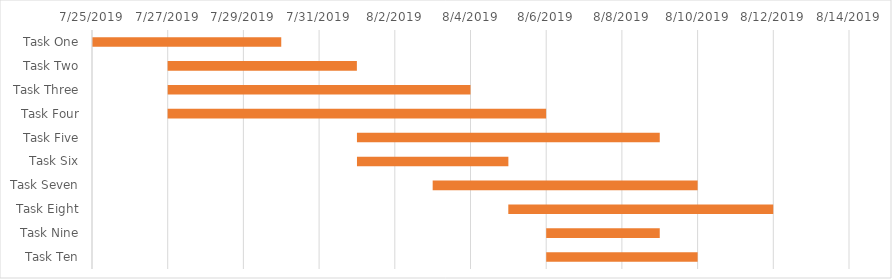
| Category | Start Data | Duration |
|---|---|---|
| Task One | 7/25/19 | 5 |
| Task Two | 7/27/19 | 5 |
| Task Three | 7/27/19 | 8 |
| Task Four | 7/27/19 | 10 |
| Task Five | 8/1/19 | 8 |
| Task Six | 8/1/19 | 4 |
| Task Seven | 8/3/19 | 7 |
| Task Eight | 8/5/19 | 7 |
| Task Nine | 8/6/19 | 3 |
| Task Ten | 8/6/19 | 4 |